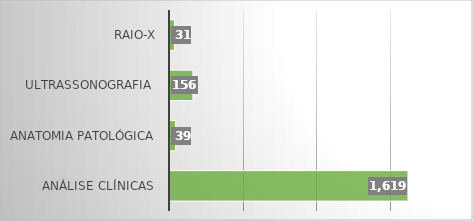
| Category | Series 0 |
|---|---|
| Análise Clínicas  | 1619 |
| Anatomia Patológica | 39 |
| Ultrassonografia  | 156 |
| RAIO-X | 31 |